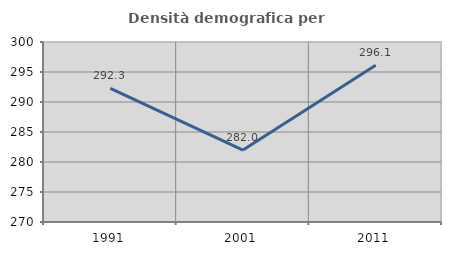
| Category | Densità demografica |
|---|---|
| 1991.0 | 292.278 |
| 2001.0 | 281.984 |
| 2011.0 | 296.134 |